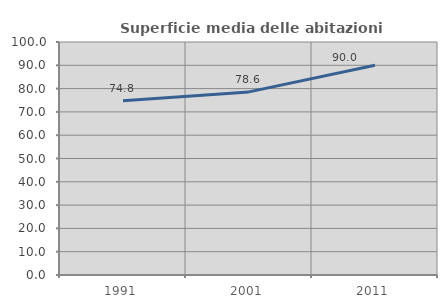
| Category | Superficie media delle abitazioni occupate |
|---|---|
| 1991.0 | 74.804 |
| 2001.0 | 78.581 |
| 2011.0 | 90.008 |